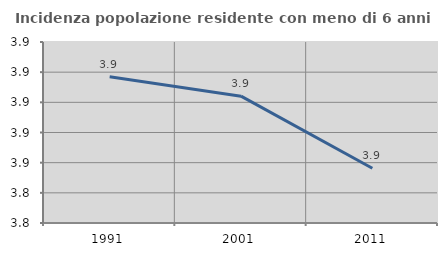
| Category | Incidenza popolazione residente con meno di 6 anni |
|---|---|
| 1991.0 | 3.917 |
| 2001.0 | 3.904 |
| 2011.0 | 3.856 |